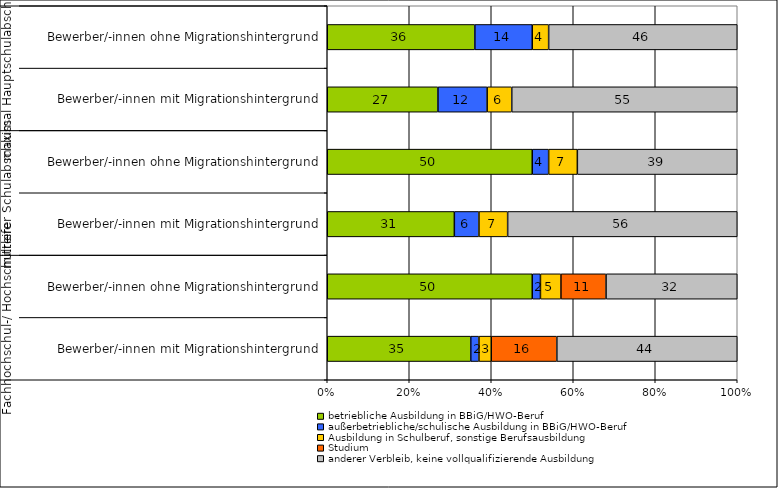
| Category | betriebliche Ausbildung in BBiG/HWO-Beruf | außerbetriebliche/schulische Ausbildung in BBiG/HWO-Beruf | Ausbildung in Schulberuf, sonstige Berufsausbildung | Studium | anderer Verbleib, keine vollqualifizierende Ausbildung |
|---|---|---|---|---|---|
| 0 | 35 | 2 | 3 | 16 | 44 |
| 1 | 50 | 2 | 5 | 11 | 32 |
| 2 | 31 | 6 | 7 | 0 | 56 |
| 3 | 50 | 4 | 7 | 0 | 39 |
| 4 | 27 | 12 | 6 | 0 | 55 |
| 5 | 36 | 14 | 4 | 0 | 46 |